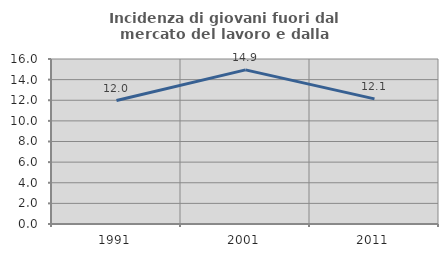
| Category | Incidenza di giovani fuori dal mercato del lavoro e dalla formazione  |
|---|---|
| 1991.0 | 11.968 |
| 2001.0 | 14.943 |
| 2011.0 | 12.134 |